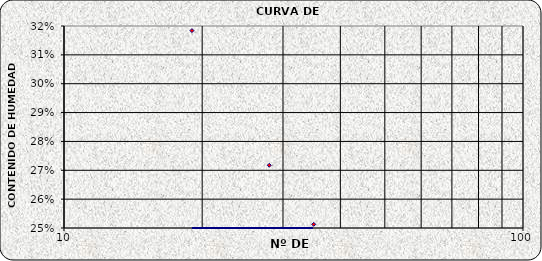
| Category | Series 0 |
|---|---|
| 35.0 | 0.251 |
| 28.0 | 0.272 |
| 19.0 | 0.318 |